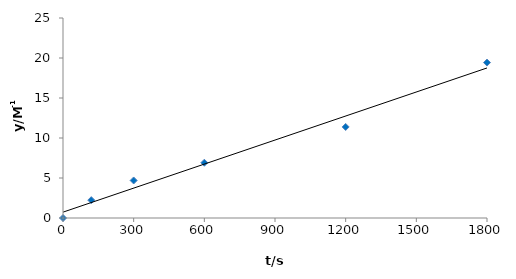
| Category | Series 0 |
|---|---|
| 0.0 | 0 |
| 120.0 | 2.231 |
| 300.0 | 4.691 |
| 600.0 | 6.908 |
| 1200.0 | 11.383 |
| 1800.0 | 19.429 |